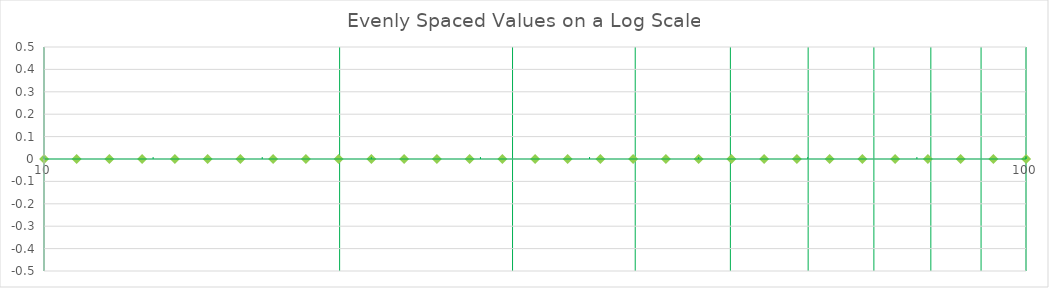
| Category | Value |
|---|---|
| 10.0 | 0 |
| 10.797751623277097 | 0 |
| 11.659144011798316 | 0 |
| 12.589254117941671 | 0 |
| 13.593563908785256 | 0 |
| 14.677992676220695 | 0 |
| 15.848931924611133 | 0 |
| 17.113283041617805 | 0 |
| 18.478497974222908 | 0 |
| 19.952623149688794 | 0 |
| 21.544346900318835 | 0 |
| 23.263050671536256 | 0 |
| 25.1188643150958 | 0 |
| 27.122725793320278 | 0 |
| 29.28644564625236 | 0 |
| 31.622776601683785 | 0 |
| 34.14548873833601 | 0 |
| 36.86945064519575 | 0 |
| 39.81071705534971 | 0 |
| 42.98662347082275 | 0 |
| 46.41588833612778 | 0 |
| 50.11872336272722 | 0 |
| 54.116952654646354 | 0 |
| 58.43414133735174 | 0 |
| 63.09573444801931 | 0 |
| 68.12920690579611 | 0 |
| 73.56422544596411 | 0 |
| 79.43282347242811 | 0 |
| 85.76958985908938 | 0 |
| 92.61187281287931 | 0 |
| 99.99999999999997 | 0 |
| 107.97751623277092 | 0 |
| 116.59144011798313 | 0 |
| 125.89254117941667 | 0 |
| 135.9356390878525 | 0 |
| 146.77992676220688 | 0 |
| 158.48931924611128 | 0 |
| 171.13283041617802 | 0 |
| 184.784979742229 | 0 |
| 199.52623149688787 | 0 |
| 215.44346900318826 | 0 |
| 232.6305067153625 | 0 |
| 251.1886431509579 | 0 |
| 271.2272579332026 | 0 |
| 292.8644564625235 | 0 |
| 316.22776601683773 | 0 |
| 341.45488738335996 | 0 |
| 368.69450645195735 | 0 |
| 398.107170553497 | 0 |
| 429.8662347082274 | 0 |
| 464.15888336127756 | 0 |
| 501.1872336272719 | 0 |
| 541.1695265464633 | 0 |
| 584.3414133735173 | 0 |
| 630.9573444801928 | 0 |
| 681.2920690579608 | 0 |
| 735.6422544596409 | 0 |
| 794.328234724281 | 0 |
| 857.6958985908935 | 0 |
| 926.1187281287927 | 0 |
| 999.9999999999993 | 0 |
| 1079.7751623277088 | 0 |
| 1165.9144011798307 | 0 |
| 1258.9254117941662 | 0 |
| 1359.3563908785245 | 0 |
| 1467.7992676220683 | 0 |
| 1584.8931924611122 | 0 |
| 1711.3283041617792 | 0 |
| 1847.8497974222892 | 0 |
| 1995.262314968878 | 0 |
| 2154.4346900318815 | 0 |
| 2326.305067153624 | 0 |
| 2511.886431509578 | 0 |
| 2712.2725793320255 | 0 |
| 2928.6445646252337 | 0 |
| 3162.2776601683754 | 0 |
| 3414.5488738335985 | 0 |
| 3686.945064519572 | 0 |
| 3981.0717055349687 | 0 |
| 4298.662347082272 | 0 |
| 4641.588833612774 | 0 |
| 5011.872336272718 | 0 |
| 5411.695265464631 | 0 |
| 5843.414133735168 | 0 |
| 6309.573444801926 | 0 |
| 6812.920690579605 | 0 |
| 7356.422544596406 | 0 |
| 7943.282347242806 | 0 |
| 8576.958985908932 | 0 |
| 9261.187281287925 | 0 |
| 9999.999999999989 | 0 |
| 10797.751623277083 | 0 |
| 11659.144011798304 | 0 |
| 12589.254117941657 | 0 |
| 13593.56390878524 | 0 |
| 14677.992676220676 | 0 |
| 15848.931924611115 | 0 |
| 17113.28304161779 | 0 |
| 18478.497974222886 | 0 |
| 19952.62314968877 | 0 |
| 21544.34690031881 | 0 |
| 23263.050671536235 | 0 |
| 25118.864315095772 | 0 |
| 27122.725793320245 | 0 |
| 29286.445646252323 | 0 |
| 31622.77660168375 | 0 |
| 34145.488738335975 | 0 |
| 36869.4506451957 | 0 |
| 39810.717055349676 | 0 |
| 42986.623470822706 | 0 |
| 46415.888336127726 | 0 |
| 50118.72336272716 | 0 |
| 54116.95265464629 | 0 |
| 58434.14133735168 | 0 |
| 63095.734448019226 | 0 |
| 68129.20690579602 | 0 |
| 73564.22544596402 | 0 |
| 79432.82347242803 | 0 |
| 85769.58985908929 | 0 |
| 92611.87281287921 | 0 |
| 99999.99999999985 | 0 |